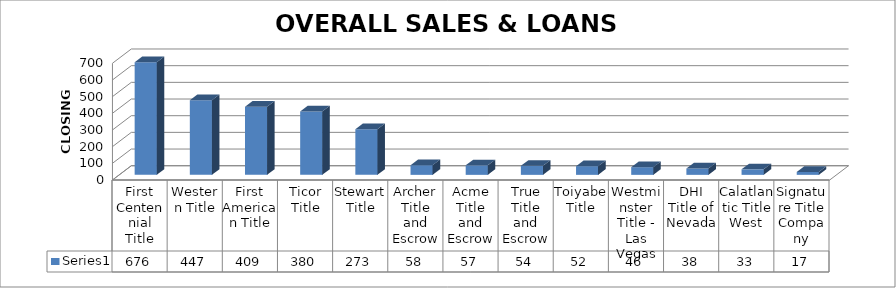
| Category | Series 0 |
|---|---|
| First Centennial Title | 676 |
| Western Title | 447 |
| First American Title | 409 |
| Ticor Title | 380 |
| Stewart Title | 273 |
| Archer Title and Escrow | 58 |
| Acme Title and Escrow | 57 |
| True Title and Escrow | 54 |
| Toiyabe Title | 52 |
| Westminster Title - Las Vegas | 46 |
| DHI Title of Nevada | 38 |
| Calatlantic Title West | 33 |
| Signature Title Company | 17 |